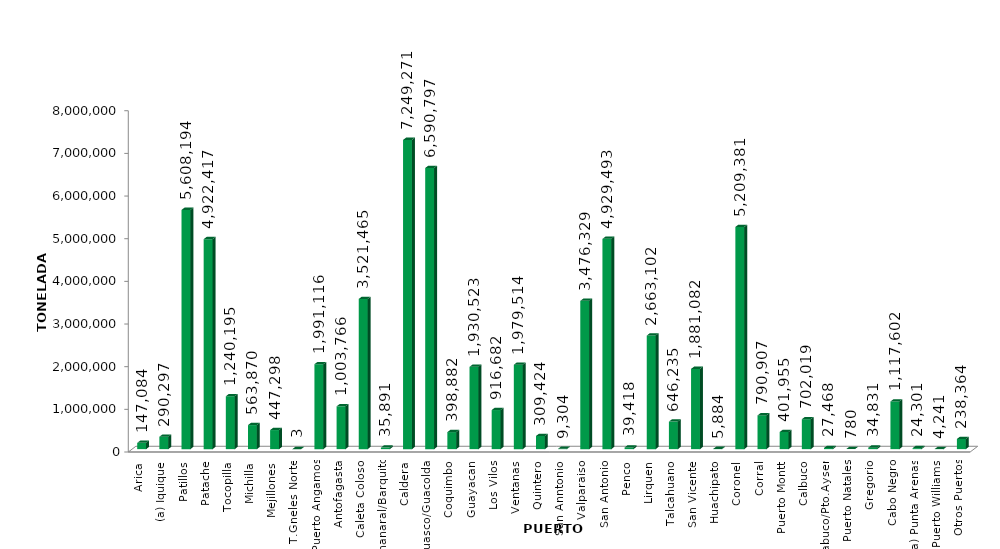
| Category | Series 0 |
|---|---|
| Arica | 147084.258 |
| (a) Iquique | 290297.421 |
| Patillos | 5608193.584 |
| Patache | 4922417.33 |
| Tocopilla | 1240194.566 |
| Michilla | 563869.601 |
| Mejillones | 447297.674 |
| T.Gneles Norte | 2.5 |
| Puerto Angamos | 1991116.243 |
| Antofagasta | 1003766.359 |
| Caleta Coloso | 3521465.09 |
| Chanaral/Barquito | 35890.743 |
| Caldera | 7249270.56 |
| Huasco/Guacolda | 6590796.703 |
| Coquimbo | 398881.806 |
| Guayacan | 1930522.682 |
| Los Vilos | 916682.29 |
| Ventanas | 1979513.713 |
| Quintero | 309424.354 |
| San Anntonio | 9304 |
| Valparaiso | 3476329.111 |
| San Antonio | 4929493.243 |
| Penco | 39418.396 |
| Lirquen | 2663101.628 |
| Talcahuano | 646234.751 |
| San Vicente | 1881081.582 |
| Huachipato | 5883.584 |
| Coronel | 5209381.419 |
| Corral | 790907.223 |
| Puerto Montt | 401955.172 |
| Calbuco | 702019.061 |
| Chacabuco/Pto.Aysen | 27468.387 |
| Puerto Natales | 780.104 |
| Gregorio | 34831.338 |
| Cabo Negro | 1117602.474 |
| (a) Punta Arenas | 24301.161 |
| Puerto Williams | 4240.9 |
| Otros Puertos | 238364.438 |